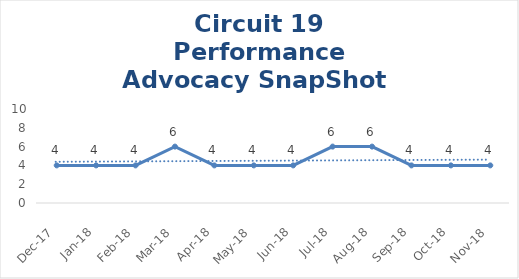
| Category | Circuit 19 |
|---|---|
| Dec-17 | 4 |
| Jan-18 | 4 |
| Feb-18 | 4 |
| Mar-18 | 6 |
| Apr-18 | 4 |
| May-18 | 4 |
| Jun-18 | 4 |
| Jul-18 | 6 |
| Aug-18 | 6 |
| Sep-18 | 4 |
| Oct-18 | 4 |
| Nov-18 | 4 |